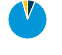
| Category | Series 0 |
|---|---|
| Electricity | 0.063 |
| Natural Gas | 0.894 |
| Distillate Fuel Oil | 0.043 |